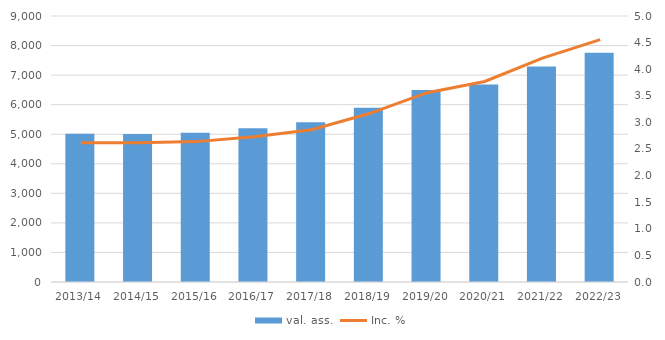
| Category | val. ass. |
|---|---|
| 2013/14 | 5012 |
| 2014/15 | 5011 |
| 2015/16 | 5052 |
| 2016/17 | 5199 |
| 2017/18 | 5404 |
| 2018/19 | 5894 |
| 2019/20 | 6499 |
| 2020/21 | 6686 |
| 2021/22 | 7291 |
| 2022/23 | 7756 |